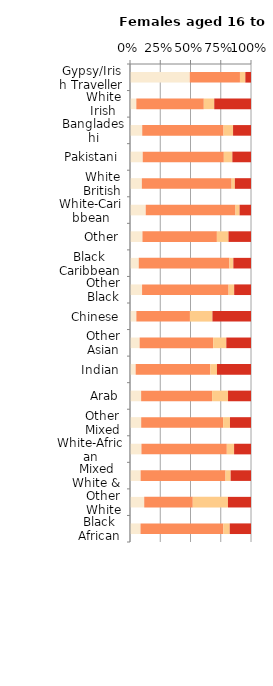
| Category | No qualifications | Below degree level qualifications | Other qualifications | Degree level qualifications |   |
|---|---|---|---|---|---|
| Gypsy/Irish Traveller | 49.386 | 41.488 | 4.438 | 4.688 |  |
| White Irish | 5.219 | 55.78 | 8.631 | 30.371 |  |
| Bangladeshi | 10.108 | 67.206 | 7.865 | 14.822 |  |
| Pakistani | 10.52 | 67.027 | 7.04 | 15.414 |  |
| White British | 9.784 | 74.2 | 2.674 | 13.342 |  |
| White-Caribbean | 12.998 | 74.194 | 3.366 | 9.442 |  |
| Other | 10.286 | 61.521 | 9.601 | 18.592 |  |
| Black Caribbean | 7.232 | 74.916 | 3.257 | 14.596 |  |
| Other Black | 9.976 | 71.495 | 4.613 | 13.915 |  |
| Chinese | 5.251 | 44.289 | 18.581 | 31.879 |  |
| Other Asian | 7.968 | 60.773 | 10.86 | 20.399 |  |
| Indian | 4.672 | 61.721 | 5.486 | 28.12 |  |
| Arab | 9.198 | 58.624 | 13.193 | 18.985 |  |
| Other Mixed | 9.246 | 67.706 | 5.666 | 17.382 |  |
| White-African | 9.464 | 70.558 | 5.996 | 13.982 |  |
| Mixed White & Asian | 8.769 | 70.194 | 4.219 | 16.818 |  |
| Other White | 11.752 | 40.149 | 29.048 | 19.051 |  |
| Black African | 8.69 | 68.519 | 5.216 | 17.575 |  |